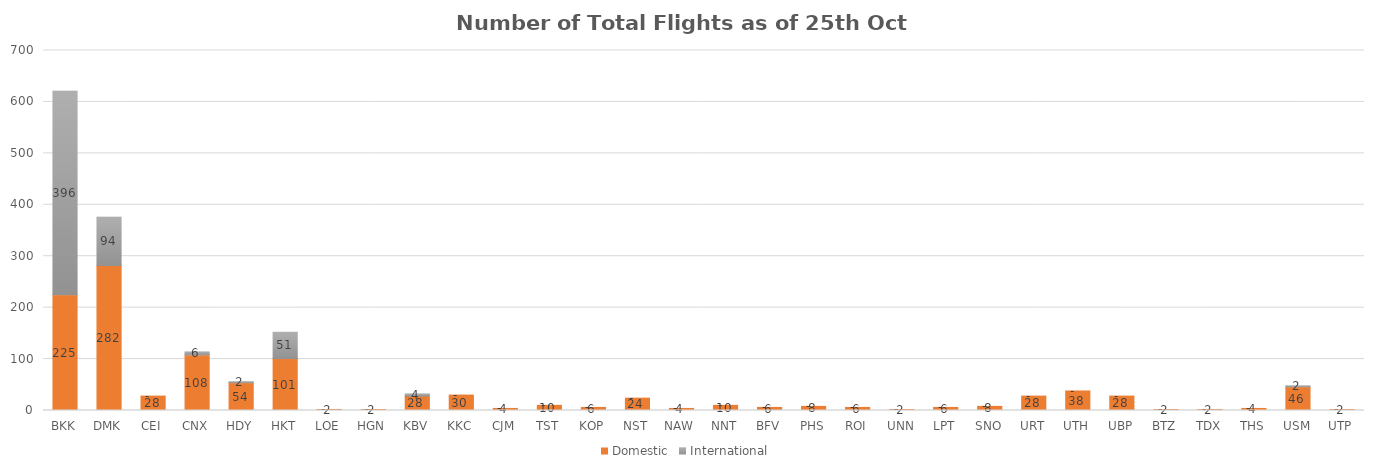
| Category | Domestic | International |
|---|---|---|
| BKK | 225 | 396 |
| DMK | 282 | 94 |
| CEI | 28 | 0 |
| CNX | 108 | 6 |
| HDY | 54 | 2 |
| HKT | 101 | 51 |
| LOE | 2 | 0 |
| HGN | 2 | 0 |
| KBV | 28 | 4 |
| KKC | 30 | 0 |
| CJM | 4 | 0 |
| TST | 10 | 0 |
| KOP | 6 | 0 |
| NST | 24 | 0 |
| NAW | 4 | 0 |
| NNT | 10 | 0 |
| BFV | 6 | 0 |
| PHS | 8 | 0 |
| ROI | 6 | 0 |
| UNN | 2 | 0 |
| LPT | 6 | 0 |
| SNO | 8 | 0 |
| URT | 28 | 0 |
| UTH | 38 | 0 |
| UBP | 28 | 0 |
| BTZ | 2 | 0 |
| TDX | 2 | 0 |
| THS | 4 | 0 |
| USM | 46 | 2 |
| UTP | 2 | 0 |